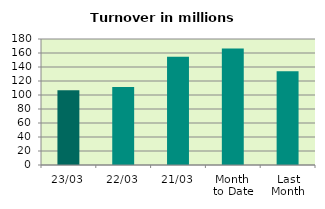
| Category | Series 0 |
|---|---|
| 23/03 | 106.927 |
| 22/03 | 111.602 |
| 21/03 | 154.605 |
| Month 
to Date | 166.596 |
| Last
Month | 133.846 |